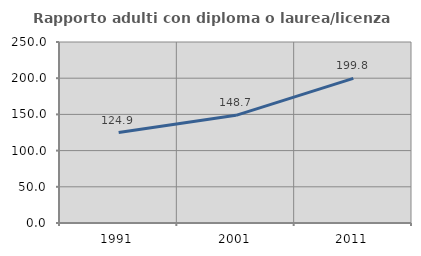
| Category | Rapporto adulti con diploma o laurea/licenza media  |
|---|---|
| 1991.0 | 124.941 |
| 2001.0 | 148.746 |
| 2011.0 | 199.806 |